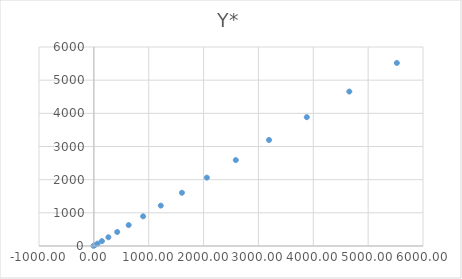
| Category | Y* |
|---|---|
| -5.652475842498529 | 5.726 |
| 18.214416446084783 | 26.006 |
| 66.91612939944221 | 70.942 |
| 147.06913031033818 | 147.789 |
| 264.7050983124842 | 262.946 |
| 425.4894505088572 | 422.257 |
| 634.8296418727859 | 631.155 |
| 897.9385784871444 | 894.761 |
| 1219.8756443470184 | 1217.936 |
| 1605.5751112842706 | 1605.333 |
| 2059.866827088421 | 2061.42 |
| 2587.49189773951 | 2590.51 |
| 3193.115001723631 | 3196.779 |
| 3881.334413834351 | 3884.281 |
| 4656.690544590266 | 4656.96 |
| 5523.673762078751 | 5518.66 |